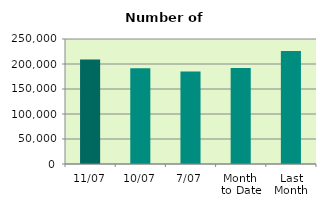
| Category | Series 0 |
|---|---|
| 11/07 | 208924 |
| 10/07 | 191534 |
| 7/07 | 185202 |
| Month 
to Date | 191908.571 |
| Last
Month | 226069.545 |